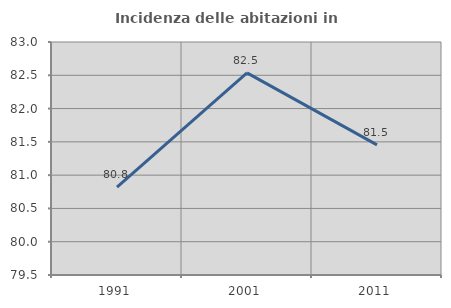
| Category | Incidenza delle abitazioni in proprietà  |
|---|---|
| 1991.0 | 80.821 |
| 2001.0 | 82.537 |
| 2011.0 | 81.455 |